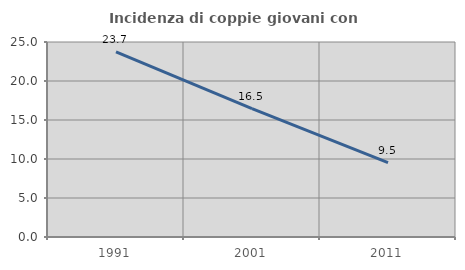
| Category | Incidenza di coppie giovani con figli |
|---|---|
| 1991.0 | 23.744 |
| 2001.0 | 16.459 |
| 2011.0 | 9.524 |